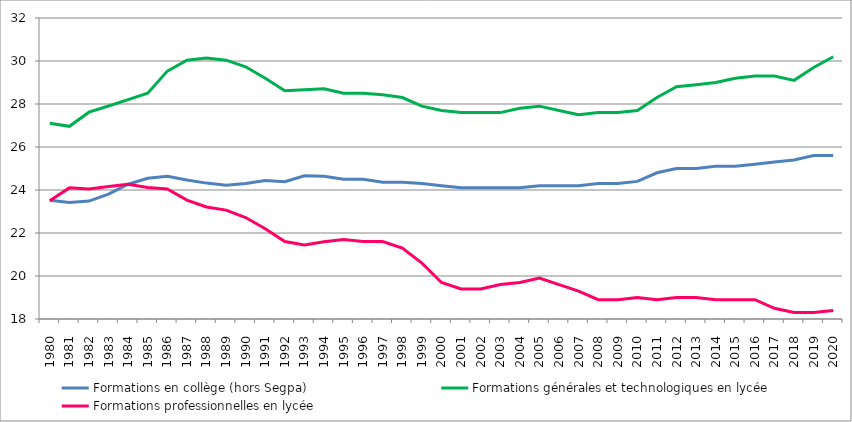
| Category | Formations en collège (hors Segpa) | Formations générales et technologiques en lycée | Formations professionnelles en lycée |
|---|---|---|---|
| 1980 | 23.523 | 27.1 | 23.5 |
| 1981 | 23.423 | 26.961 | 24.099 |
| 1982 | 23.485 | 27.62 | 24.043 |
| 1983 | 23.805 | 27.908 | 24.165 |
| 1984 | 24.267 | 28.202 | 24.266 |
| 1985 | 24.546 | 28.5 | 24.121 |
| 1986 | 24.644 | 29.532 | 24.044 |
| 1987 | 24.462 | 30.038 | 23.532 |
| 1988 | 24.321 | 30.138 | 23.21 |
| 1989 | 24.221 | 30.038 | 23.066 |
| 1990 | 24.3 | 29.732 | 22.721 |
| 1991 | 24.441 | 29.196 | 22.199 |
| 1992 | 24.382 | 28.62 | 21.6 |
| 1993 | 24.662 | 28.667 | 21.444 |
| 1994 | 24.641 | 28.708 | 21.589 |
| 1995 | 24.5 | 28.5 | 21.7 |
| 1996 | 24.5 | 28.5 | 21.6 |
| 1997 | 24.362 | 28.431 | 21.6 |
| 1998 | 24.362 | 28.3 | 21.3 |
| 1999 | 24.3 | 27.9 | 20.6 |
| 2000 | 24.2 | 27.7 | 19.7 |
| 2001 | 24.1 | 27.6 | 19.4 |
| 2002 | 24.1 | 27.6 | 19.4 |
| 2003 | 24.1 | 27.6 | 19.6 |
| 2004 | 24.1 | 27.8 | 19.7 |
| 2005 | 24.2 | 27.9 | 19.9 |
| 2006 | 24.2 | 27.7 | 19.6 |
| 2007 | 24.2 | 27.5 | 19.3 |
| 2008 | 24.3 | 27.6 | 18.9 |
| 2009 | 24.3 | 27.6 | 18.9 |
| 2010 | 24.4 | 27.7 | 19 |
| 2011 | 24.8 | 28.3 | 18.9 |
| 2012 | 25 | 28.8 | 19 |
| 2013 | 25 | 28.9 | 19 |
| 2014 | 25.1 | 29 | 18.9 |
| 2015 | 25.1 | 29.2 | 18.9 |
| 2016 | 25.2 | 29.3 | 18.9 |
| 2017 | 25.3 | 29.3 | 18.5 |
| 2018 | 25.4 | 29.1 | 18.3 |
| 2019 | 25.6 | 29.7 | 18.3 |
| 2020 | 25.6 | 30.2 | 18.4 |